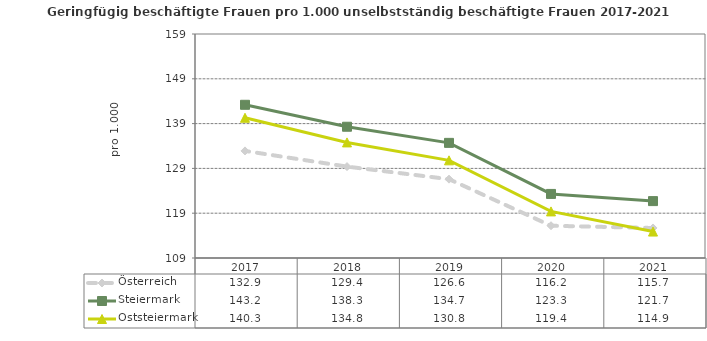
| Category | Österreich | Steiermark | Oststeiermark |
|---|---|---|---|
| 2021.0 | 115.7 | 121.7 | 114.9 |
| 2020.0 | 116.2 | 123.3 | 119.4 |
| 2019.0 | 126.6 | 134.7 | 130.8 |
| 2018.0 | 129.4 | 138.3 | 134.8 |
| 2017.0 | 132.9 | 143.2 | 140.3 |